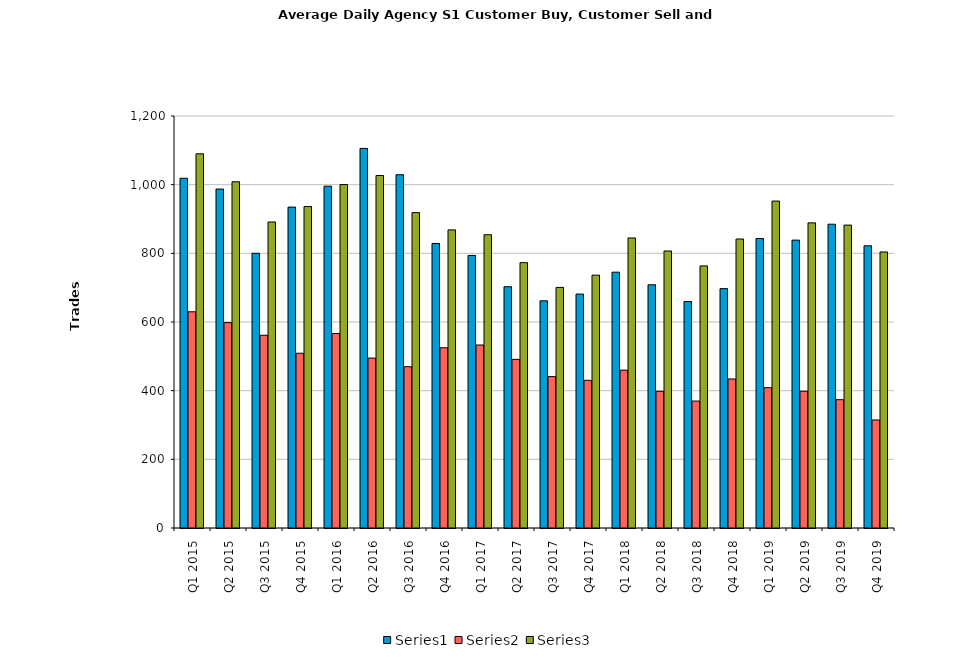
| Category | Series 0 | Series 1 | Series 2 |
|---|---|---|---|
| Q1 2015 | 1018.672 | 629.803 | 1089.902 |
| Q2 2015 | 987.222 | 598.317 | 1008.46 |
| Q3 2015 | 800.078 | 561.359 | 891.312 |
| Q4 2015 | 934.656 | 509 | 936.266 |
| Q1 2016 | 995.656 | 566.607 | 1000.246 |
| Q2 2016 | 1105.578 | 494.969 | 1026.594 |
| Q3 2016 | 1028.922 | 469.828 | 918.625 |
| Q4 2016 | 828.651 | 525.016 | 868.317 |
| Q1 2017 | 793.887 | 533.016 | 854.177 |
| Q2 2017 | 702.762 | 491.206 | 772.857 |
| Q3 2017 | 661.651 | 440.937 | 700.746 |
| Q4 2017 | 681.365 | 430.111 | 736.524 |
| Q1 2018 | 745.098 | 459.869 | 844.754 |
| Q2 2018 | 708.406 | 398.219 | 806.812 |
| Q3 2018 | 659.667 | 369.762 | 763.397 |
| Q4 2018 | 697.19 | 434.127 | 841.746 |
| Q1 2019 | 843.295 | 408.787 | 952.246 |
| Q2 2019 | 838.492 | 398.349 | 888.746 |
| Q3 2019 | 884.844 | 373.766 | 882.172 |
| Q4 2019 | 821.906 | 314.656 | 804 |